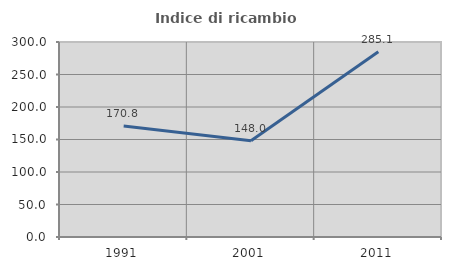
| Category | Indice di ricambio occupazionale  |
|---|---|
| 1991.0 | 170.759 |
| 2001.0 | 147.961 |
| 2011.0 | 285.127 |